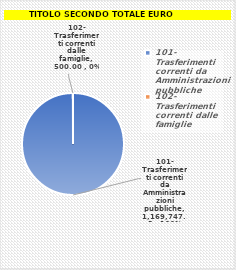
| Category | Series 0 |
|---|---|
| 101- Trasferimenti correnti da Amministrazioni pubbliche | 1169747.13 |
| 102- Trasferimenti correnti dalle famiglie | 500 |